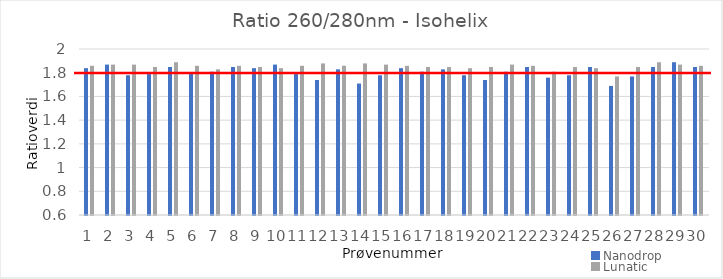
| Category | Nanodrop | Lunatic |
|---|---|---|
| 0 | 1.83 | 1.85 |
| 1 | 1.86 | 1.86 |
| 2 | 1.77 | 1.86 |
| 3 | 1.78 | 1.84 |
| 4 | 1.84 | 1.88 |
| 5 | 1.79 | 1.85 |
| 6 | 1.8 | 1.82 |
| 7 | 1.84 | 1.85 |
| 8 | 1.83 | 1.84 |
| 9 | 1.86 | 1.83 |
| 10 | 1.78 | 1.85 |
| 11 | 1.73 | 1.87 |
| 12 | 1.82 | 1.85 |
| 13 | 1.7 | 1.87 |
| 14 | 1.77 | 1.86 |
| 15 | 1.83 | 1.85 |
| 16 | 1.8 | 1.84 |
| 17 | 1.82 | 1.84 |
| 18 | 1.77 | 1.83 |
| 19 | 1.73 | 1.84 |
| 20 | 1.8 | 1.86 |
| 21 | 1.84 | 1.85 |
| 22 | 1.75 | 1.8 |
| 23 | 1.77 | 1.84 |
| 24 | 1.84 | 1.83 |
| 25 | 1.68 | 1.76 |
| 26 | 1.76 | 1.84 |
| 27 | 1.84 | 1.88 |
| 28 | 1.88 | 1.86 |
| 29 | 1.84 | 1.85 |